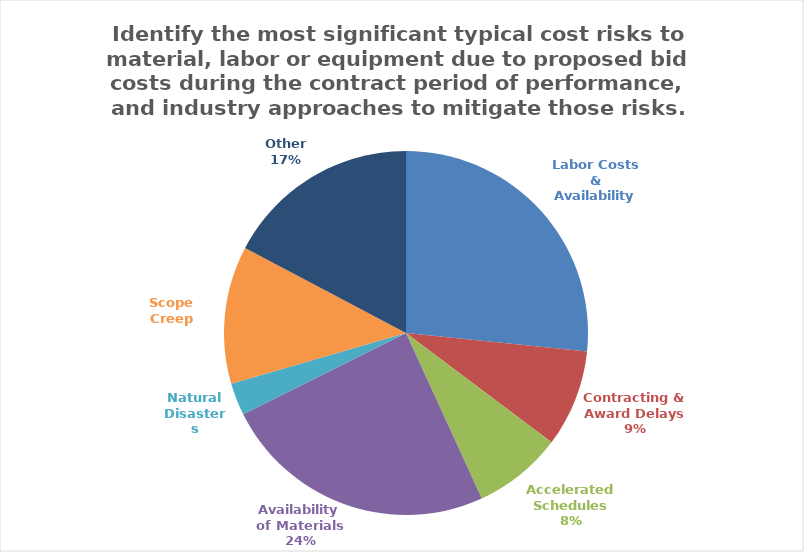
| Category | Series 0 |
|---|---|
| Labor Costs & Availability | 0.266 |
| Contracting &
Award Delays | 0.086 |
| Accelerated
Schedules | 0.079 |
| Availability of Materials | 0.245 |
| Natural
Disasters | 0.029 |
| Scope Creep | 0.122 |
| Other | 0.173 |